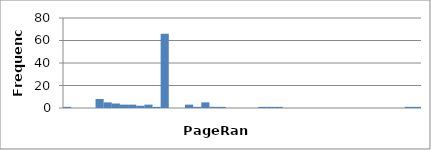
| Category | 1 |
|---|---|
| 0.0 | 1 |
| 0.023255813953488372 | 0 |
| 0.046511627906976744 | 0 |
| 0.06976744186046512 | 0 |
| 0.09302325581395349 | 8 |
| 0.11627906976744186 | 5 |
| 0.13953488372093023 | 4 |
| 0.16279069767441862 | 3 |
| 0.18604651162790697 | 3 |
| 0.20930232558139533 | 2 |
| 0.2325581395348837 | 3 |
| 0.25581395348837205 | 1 |
| 0.2790697674418604 | 66 |
| 0.30232558139534876 | 0 |
| 0.3255813953488371 | 0 |
| 0.3488372093023255 | 3 |
| 0.37209302325581384 | 1 |
| 0.3953488372093022 | 5 |
| 0.41860465116279055 | 1 |
| 0.4418604651162789 | 1 |
| 0.46511627906976727 | 0 |
| 0.4883720930232556 | 0 |
| 0.511627906976744 | 0 |
| 0.5348837209302324 | 0 |
| 0.5581395348837208 | 1 |
| 0.5813953488372092 | 1 |
| 0.6046511627906976 | 1 |
| 0.627906976744186 | 0 |
| 0.6511627906976745 | 0 |
| 0.6744186046511629 | 0 |
| 0.6976744186046513 | 0 |
| 0.7209302325581397 | 0 |
| 0.7441860465116281 | 0 |
| 0.7674418604651165 | 0 |
| 0.790697674418605 | 0 |
| 0.8139534883720934 | 0 |
| 0.8372093023255818 | 0 |
| 0.8604651162790702 | 0 |
| 0.8837209302325586 | 0 |
| 0.906976744186047 | 0 |
| 0.9302325581395354 | 0 |
| 0.9534883720930238 | 0 |
| 0.9767441860465123 | 1 |
| 1.0 | 1 |